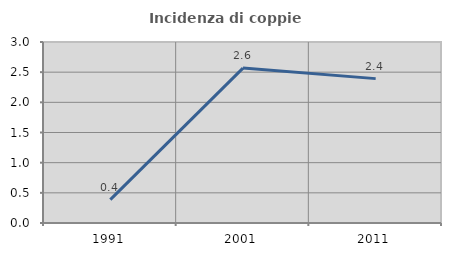
| Category | Incidenza di coppie miste |
|---|---|
| 1991.0 | 0.388 |
| 2001.0 | 2.568 |
| 2011.0 | 2.393 |